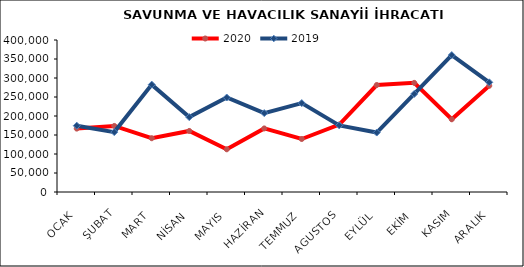
| Category | 2020 | 2019 |
|---|---|---|
| OCAK | 166851.079 | 174498.064 |
| ŞUBAT | 173864.446 | 157623.006 |
| MART | 141493.826 | 282563.324 |
| NİSAN | 160660.437 | 197032.04 |
| MAYIS | 112401.962 | 248662.949 |
| HAZİRAN | 167258.774 | 207582.28 |
| TEMMUZ | 139475.379 | 233957.429 |
| AGUSTOS | 177409.444 | 175314.588 |
| EYLÜL | 281550.578 | 156438.215 |
| EKİM | 287183.776 | 258091.334 |
| KASIM | 191365.558 | 360282.888 |
| ARALIK | 279511.542 | 288648.052 |